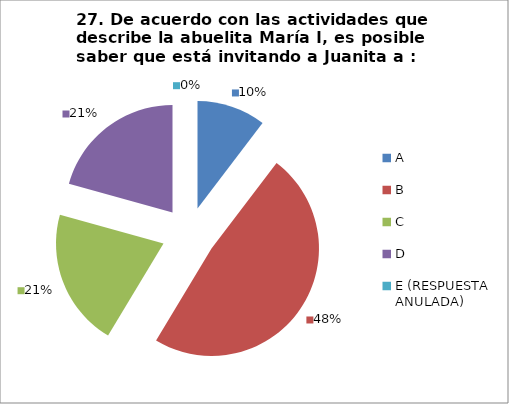
| Category | CANTIDAD DE RESPUESTAS PREGUNTA (23) | PORCENTAJE |
|---|---|---|
| A | 3 | 0.103 |
| B | 14 | 0.483 |
| C | 6 | 0.207 |
| D | 6 | 0.207 |
| E (RESPUESTA ANULADA) | 0 | 0 |